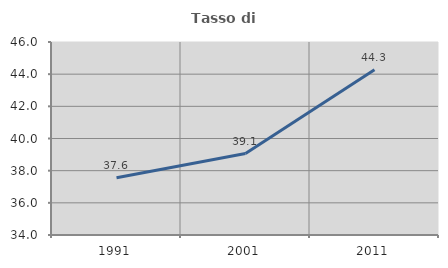
| Category | Tasso di occupazione   |
|---|---|
| 1991.0 | 37.565 |
| 2001.0 | 39.064 |
| 2011.0 | 44.269 |